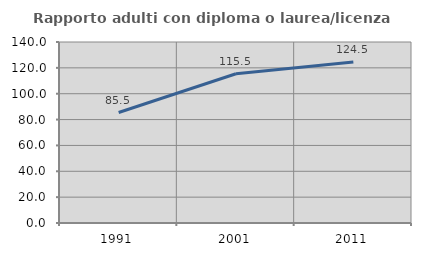
| Category | Rapporto adulti con diploma o laurea/licenza media  |
|---|---|
| 1991.0 | 85.455 |
| 2001.0 | 115.476 |
| 2011.0 | 124.49 |